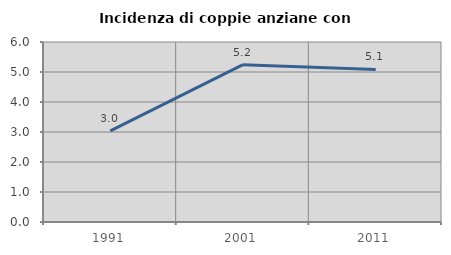
| Category | Incidenza di coppie anziane con figli |
|---|---|
| 1991.0 | 3.041 |
| 2001.0 | 5.243 |
| 2011.0 | 5.085 |